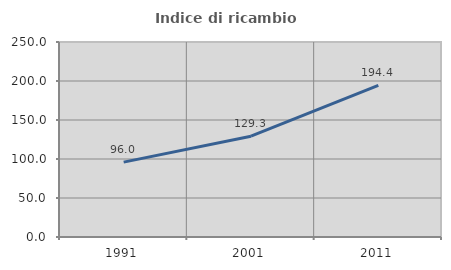
| Category | Indice di ricambio occupazionale  |
|---|---|
| 1991.0 | 95.982 |
| 2001.0 | 129.255 |
| 2011.0 | 194.388 |